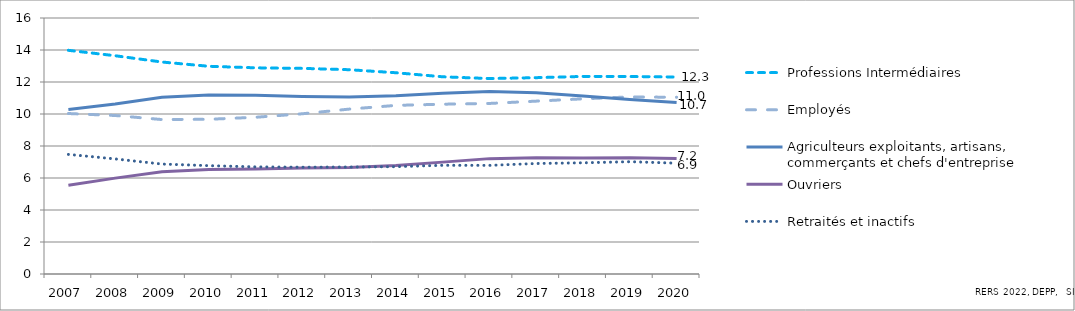
| Category | Professions Intermédiaires | Employés | Agriculteurs exploitants, artisans, commerçants et chefs d'entreprise | Ouvriers | Retraités et inactifs |
|---|---|---|---|---|---|
| 2007.0 | 13.98 | 10.03 | 10.283 | 5.552 | 7.475 |
| 2008.0 | 13.641 | 9.906 | 10.626 | 5.993 | 7.192 |
| 2009.0 | 13.248 | 9.653 | 11.044 | 6.384 | 6.872 |
| 2010.0 | 12.983 | 9.67 | 11.194 | 6.529 | 6.771 |
| 2011.0 | 12.886 | 9.795 | 11.17 | 6.562 | 6.695 |
| 2012.0 | 12.852 | 10.014 | 11.1 | 6.618 | 6.675 |
| 2013.0 | 12.769 | 10.305 | 11.056 | 6.654 | 6.685 |
| 2014.0 | 12.579 | 10.538 | 11.135 | 6.781 | 6.709 |
| 2015.0 | 12.325 | 10.612 | 11.302 | 6.992 | 6.793 |
| 2016.0 | 12.216 | 10.659 | 11.4 | 7.211 | 6.788 |
| 2017.0 | 12.271 | 10.804 | 11.326 | 7.264 | 6.906 |
| 2018.0 | 12.349 | 10.948 | 11.127 | 7.246 | 6.95 |
| 2019.0 | 12.344 | 11.068 | 10.912 | 7.272 | 7.018 |
| 2020.0 | 12.311 | 11.045 | 10.725 | 7.219 | 6.927 |